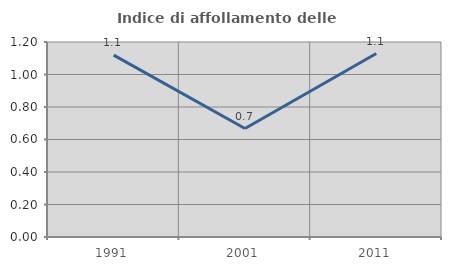
| Category | Indice di affollamento delle abitazioni  |
|---|---|
| 1991.0 | 1.119 |
| 2001.0 | 0.668 |
| 2011.0 | 1.129 |